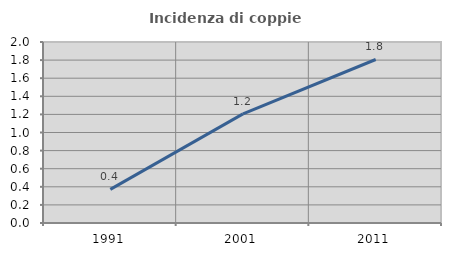
| Category | Incidenza di coppie miste |
|---|---|
| 1991.0 | 0.371 |
| 2001.0 | 1.206 |
| 2011.0 | 1.807 |